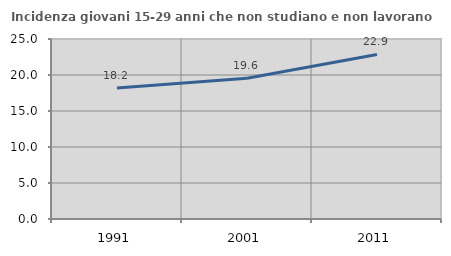
| Category | Incidenza giovani 15-29 anni che non studiano e non lavorano  |
|---|---|
| 1991.0 | 18.195 |
| 2001.0 | 19.558 |
| 2011.0 | 22.86 |